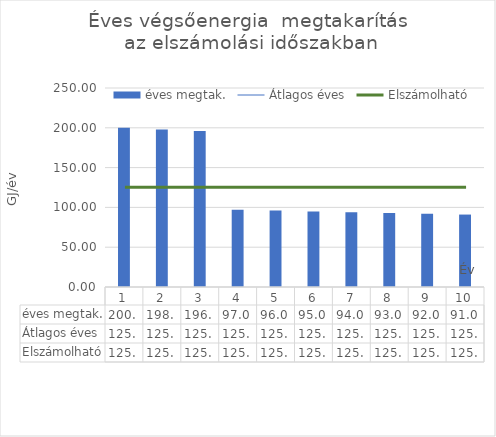
| Category | éves megtak. |
|---|---|
| 0 | 200 |
| 1 | 198 |
| 2 | 196 |
| 3 | 97 |
| 4 | 96 |
| 5 | 95 |
| 6 | 94 |
| 7 | 93 |
| 8 | 92 |
| 9 | 91 |